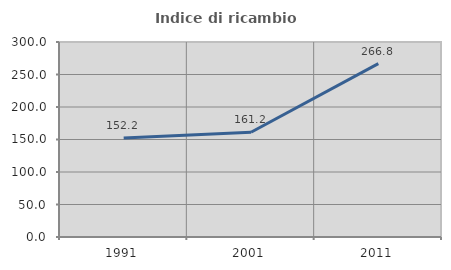
| Category | Indice di ricambio occupazionale  |
|---|---|
| 1991.0 | 152.228 |
| 2001.0 | 161.23 |
| 2011.0 | 266.791 |